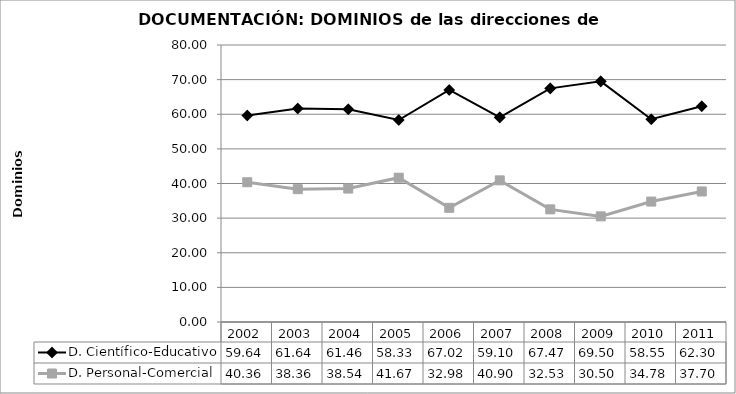
| Category | D. Científico-Educativo | D. Personal-Comercial |
|---|---|---|
| 2002.0 | 59.64 | 40.36 |
| 2003.0 | 61.637 | 38.363 |
| 2004.0 | 61.459 | 38.541 |
| 2005.0 | 58.328 | 41.672 |
| 2006.0 | 67.025 | 32.975 |
| 2007.0 | 59.096 | 40.904 |
| 2008.0 | 67.472 | 32.528 |
| 2009.0 | 69.496 | 30.504 |
| 2010.0 | 58.554 | 34.779 |
| 2011.0 | 62.297 | 37.703 |